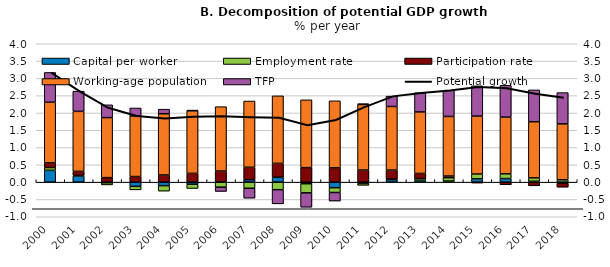
| Category | Capital per worker | Employment rate | Participation rate | Working-age population | TFP |
|---|---|---|---|---|---|
| 2000.0 | 0.342 | 0.08 | 0.134 | 1.754 | 0.861 |
| 2001.0 | 0.181 | 0.014 | 0.117 | 1.735 | 0.584 |
| 2002.0 | -0.017 | -0.062 | 0.131 | 1.735 | 0.37 |
| 2003.0 | -0.121 | -0.101 | 0.162 | 1.747 | 0.235 |
| 2004.0 | -0.101 | -0.159 | 0.208 | 1.769 | 0.132 |
| 2005.0 | -0.06 | -0.123 | 0.254 | 1.808 | 0.021 |
| 2006.0 | 0.011 | -0.145 | 0.31 | 1.861 | -0.124 |
| 2007.0 | 0.071 | -0.176 | 0.359 | 1.914 | -0.287 |
| 2008.0 | 0.144 | -0.217 | 0.399 | 1.952 | -0.409 |
| 2009.0 | -0.046 | -0.264 | 0.42 | 1.96 | -0.415 |
| 2010.0 | -0.16 | -0.139 | 0.413 | 1.938 | -0.247 |
| 2011.0 | -0.041 | -0.05 | 0.351 | 1.894 | 0.022 |
| 2012.0 | 0.073 | 0.016 | 0.26 | 1.838 | 0.299 |
| 2013.0 | 0.051 | 0.051 | 0.149 | 1.778 | 0.556 |
| 2014.0 | 0.033 | 0.096 | 0.049 | 1.722 | 0.758 |
| 2015.0 | 0.095 | 0.14 | -0.025 | 1.674 | 0.875 |
| 2016.0 | 0.104 | 0.137 | -0.075 | 1.639 | 0.918 |
| 2017.0 | 0.026 | 0.098 | -0.105 | 1.623 | 0.919 |
| 2018.0 | -0.027 | 0.068 | -0.117 | 1.616 | 0.904 |